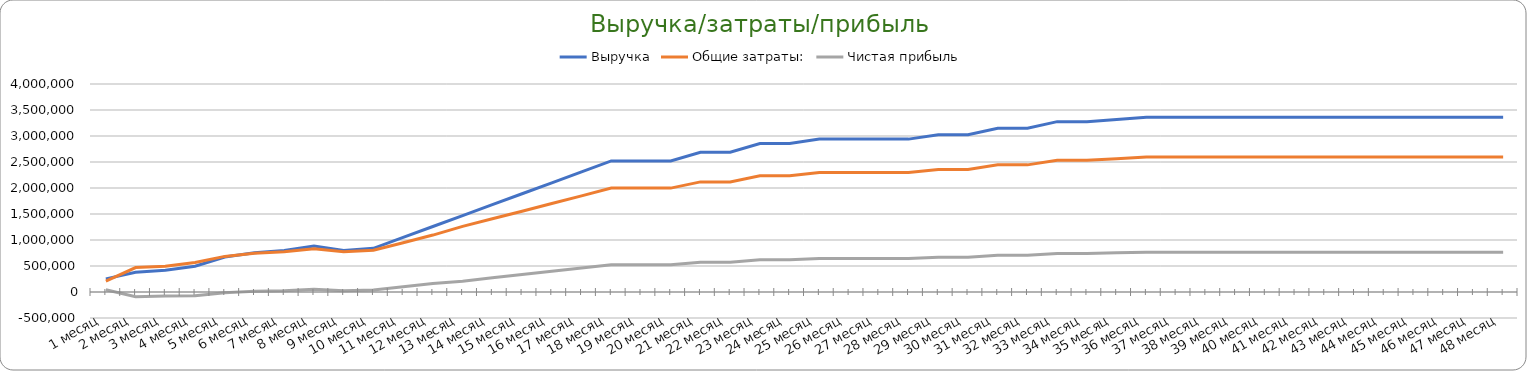
| Category | Выручка | Общие затраты: | Чистая прибыль |
|---|---|---|---|
| 1 месяц | 252000 | 209170 | 42830 |
| 2 месяц | 378000 | 470005 | -92005 |
| 3 месяц | 420000 | 495450 | -75450 |
| 4 месяц | 495600 | 566901 | -71301 |
| 5 месяц | 672000 | 684720 | -12720 |
| 6 месяц | 756000 | 743310 | 12690 |
| 7 месяц | 798000 | 772605 | 25395 |
| 8 месяц | 882000 | 831195 | 50805 |
| 9 месяц | 798000 | 772605 | 25395 |
| 10 месяц | 840000 | 801900 | 38100 |
| 11 месяц | 1050000 | 948375 | 101625 |
| 12 месяц | 1260000 | 1094850 | 165150 |
| 13 месяц | 1470000 | 1261325 | 208675 |
| 14 месяц | 1680000 | 1407800 | 272200 |
| 15 месяц | 1890000 | 1554275 | 335725 |
| 16 месяц | 2100000 | 1700750 | 399250 |
| 17 месяц | 2310000 | 1849175 | 460825 |
| 18 месяц | 2520000 | 1998100 | 521900 |
| 19 месяц | 2520000 | 1998100 | 521900 |
| 20 месяц | 2520000 | 1998100 | 521900 |
| 21 месяц | 2688000 | 2117240 | 570760 |
| 22 месяц | 2688000 | 2117240 | 570760 |
| 23 месяц | 2856000 | 2236380 | 619620 |
| 24 месяц | 2856000 | 2236380 | 619620 |
| 25 месяц | 2940000 | 2295950 | 644050 |
| 26 месяц | 2940000 | 2295950 | 644050 |
| 27 месяц | 2940000 | 2295950 | 644050 |
| 28 месяц | 2940000 | 2295950 | 644050 |
| 29 месяц | 3024000 | 2355520 | 668480 |
| 30 месяц | 3024000 | 2355520 | 668480 |
| 31 месяц | 3150000 | 2444875 | 705125 |
| 32 месяц | 3150000 | 2444875 | 705125 |
| 33 месяц | 3276000 | 2534230 | 741770 |
| 34 месяц | 3276000 | 2534230 | 741770 |
| 35 месяц | 3318000 | 2564015 | 753985 |
| 36 месяц | 3360000 | 2593800 | 766200 |
| 37 месяц | 3360000 | 2593800 | 766200 |
| 38 месяц | 3360000 | 2593800 | 766200 |
| 39 месяц | 3360000 | 2593800 | 766200 |
| 40 месяц | 3360000 | 2593800 | 766200 |
| 41 месяц | 3360000 | 2593800 | 766200 |
| 42 месяц | 3360000 | 2593800 | 766200 |
| 43 месяц | 3360000 | 2593800 | 766200 |
| 44 месяц | 3360000 | 2593800 | 766200 |
| 45 месяц | 3360000 | 2593800 | 766200 |
| 46 месяц | 3360000 | 2593800 | 766200 |
| 47 месяц | 3360000 | 2593800 | 766200 |
| 48 месяц | 3360000 | 2593800 | 766200 |